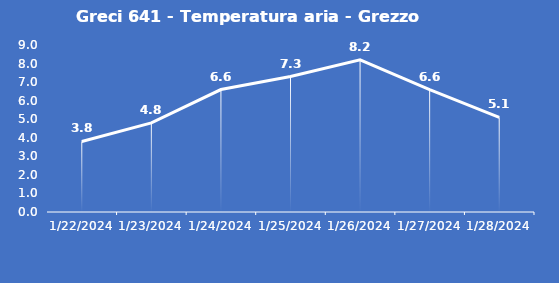
| Category | Greci 641 - Temperatura aria - Grezzo (°C) |
|---|---|
| 1/22/24 | 3.8 |
| 1/23/24 | 4.8 |
| 1/24/24 | 6.6 |
| 1/25/24 | 7.3 |
| 1/26/24 | 8.2 |
| 1/27/24 | 6.6 |
| 1/28/24 | 5.1 |